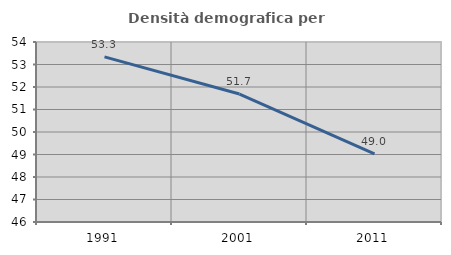
| Category | Densità demografica |
|---|---|
| 1991.0 | 53.34 |
| 2001.0 | 51.687 |
| 2011.0 | 49.025 |